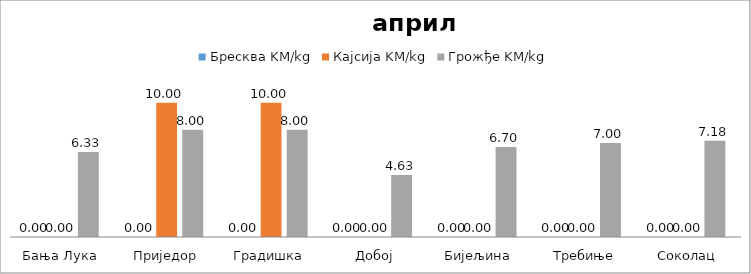
| Category | Бресква KM/kg | Кајсија KM/kg | Грожђе KM/kg |
|---|---|---|---|
| Бања Лука | 0 | 0 | 6.333 |
| Приједор | 0 | 10 | 8 |
| Градишка | 0 | 10 | 8 |
| Добој | 0 | 0 | 4.625 |
| Бијељина | 0 | 0 | 6.7 |
|  Требиње | 0 | 0 | 7 |
| Соколац | 0 | 0 | 7.175 |